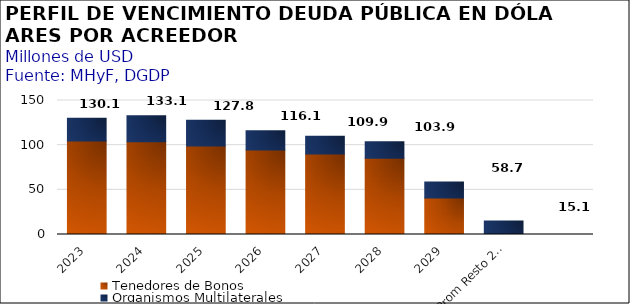
| Category | Tenedores de Bonos | Organismos Multilaterales | Bancos Nacionales e Internacionales |
|---|---|---|---|
| 2023 | 104.529 | 25.615 | 0 |
| 2024 | 103.754 | 29.313 | 0 |
| 2025 | 99.171 | 28.604 | 0 |
| 2026 | 94.589 | 21.545 | 0 |
| 2027 | 90.006 | 19.853 | 0 |
| 2028 | 85.424 | 18.447 | 0 |
| 2029 | 40.993 | 17.661 | 0 |
| Prom Resto 2030-2050 | 0 | 15.091 | 0 |